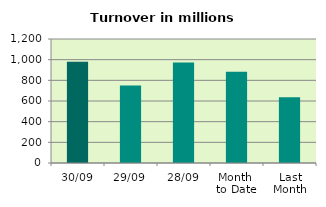
| Category | Series 0 |
|---|---|
| 30/09 | 980.654 |
| 29/09 | 750.442 |
| 28/09 | 971.633 |
| Month 
to Date | 883.598 |
| Last
Month | 635.477 |